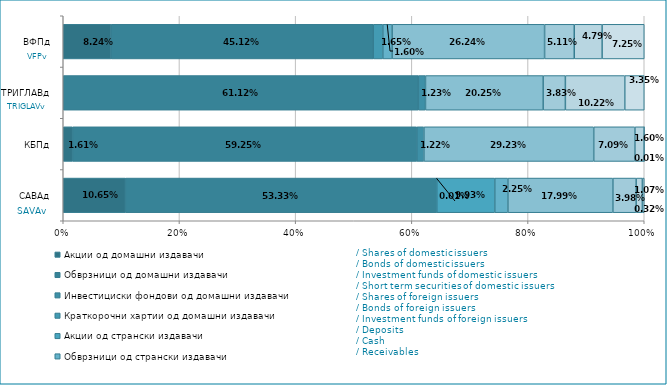
| Category | Акции од домашни издавачи  | Обврзници од домашни издавачи  | Инвестициски фондови од домашни издавачи   | Краткорочни хартии од домашни издавачи   | Акции од странски издавачи   | Обврзници од странски издавачи  | Инвестициски фондови од странски издавaчи  | Депозити | Парични средства | Побарувања |
|---|---|---|---|---|---|---|---|---|---|---|
| САВАд | 0.106 | 0.533 | 0 | 0 | 0.099 | 0.022 | 0.18 | 0.04 | 0.011 | 0.003 |
| КБПд | 0.016 | 0.593 | 0.012 | 0 | 0 | 0 | 0.292 | 0.071 | 0.016 | 0 |
| ТРИГЛАВд | 0 | 0.611 | 0.012 | 0 | 0 | 0 | 0.203 | 0.038 | 0.102 | 0.034 |
| ВФПд | 0.082 | 0.451 | 0 | 0.016 | 0 | 0.016 | 0.262 | 0.051 | 0.048 | 0.073 |